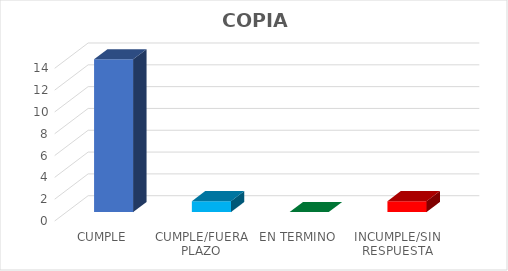
| Category | Series 0 |
|---|---|
| CUMPLE | 14 |
| CUMPLE/FUERA PLAZO | 1 |
| EN TERMINO | 0 |
| INCUMPLE/SIN RESPUESTA | 1 |